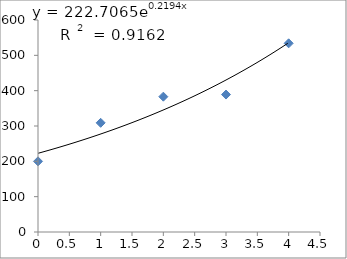
| Category | Series 0 |
|---|---|
| 0.0 | 200 |
| 1.0 | 309 |
| 2.0 | 383 |
| 3.0 | 389 |
| 4.0 | 534 |